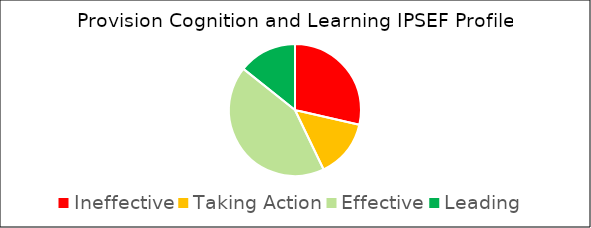
| Category | Count | % |
|---|---|---|
| Ineffective | 2 | 0.286 |
| Taking Action | 1 | 0.143 |
| Effective | 3 | 0.429 |
| Leading | 1 | 0.143 |